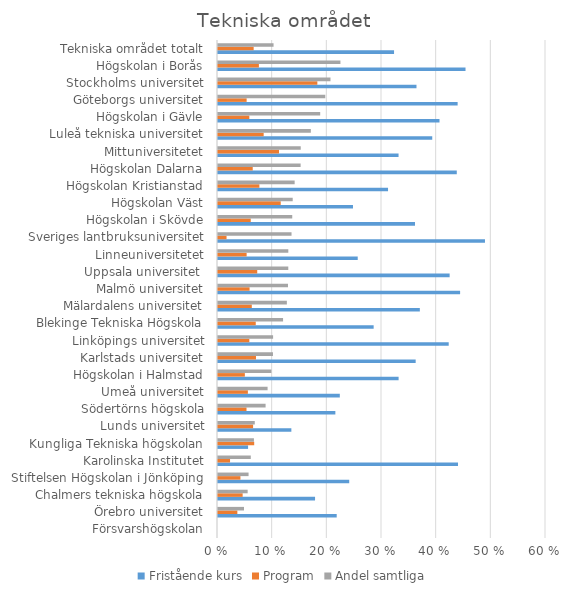
| Category | Fristående kurs | Program | Andel samtliga |
|---|---|---|---|
| Försvarshögskolan | 0 | 0 | 0 |
| Örebro universitet | 0.217 | 0.035 | 0.048 |
| Chalmers tekniska högskola | 0.178 | 0.045 | 0.054 |
| Stiftelsen Högskolan i Jönköping | 0.24 | 0.041 | 0.056 |
| Karolinska Institutet | 0.439 | 0.022 | 0.06 |
| Kungliga Tekniska högskolan | 0.055 | 0.066 | 0.066 |
| Lunds universitet | 0.134 | 0.064 | 0.067 |
| Södertörns högskola | 0.215 | 0.052 | 0.087 |
| Umeå universitet | 0.223 | 0.055 | 0.091 |
| Högskolan i Halmstad | 0.33 | 0.049 | 0.098 |
| Karlstads universitet | 0.362 | 0.069 | 0.101 |
| Linköpings universitet | 0.422 | 0.057 | 0.101 |
| Blekinge Tekniska Högskola | 0.285 | 0.069 | 0.119 |
| Mälardalens universitet | 0.369 | 0.062 | 0.126 |
| Malmö universitet | 0.443 | 0.058 | 0.128 |
| Uppsala universitet  | 0.424 | 0.072 | 0.129 |
| Linneuniversitetet | 0.256 | 0.052 | 0.129 |
| Sveriges lantbruksuniversitet | 0.488 | 0.016 | 0.135 |
| Högskolan i Skövde | 0.36 | 0.06 | 0.136 |
| Högskolan Väst | 0.247 | 0.115 | 0.137 |
| Högskolan Kristianstad | 0.311 | 0.076 | 0.14 |
| Högskolan Dalarna | 0.437 | 0.064 | 0.151 |
| Mittuniversitetet | 0.33 | 0.112 | 0.151 |
| Luleå tekniska universitet | 0.392 | 0.084 | 0.17 |
| Högskolan i Gävle | 0.405 | 0.057 | 0.187 |
| Göteborgs universitet | 0.438 | 0.052 | 0.196 |
| Stockholms universitet | 0.363 | 0.182 | 0.206 |
| Högskolan i Borås | 0.453 | 0.075 | 0.224 |
| Tekniska området totalt | 0.322 | 0.065 | 0.102 |